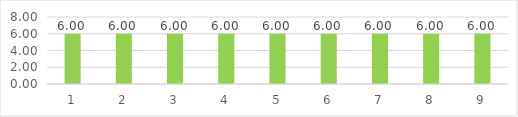
| Category | Series 0 |
|---|---|
| 0 | 6 |
| 1 | 6 |
| 2 | 6 |
| 3 | 6 |
| 4 | 6 |
| 5 | 6 |
| 6 | 6 |
| 7 | 6 |
| 8 | 6 |